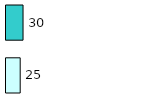
| Category | Series 0 | Series 1 |
|---|---|---|
| 0 | 25 | 30 |